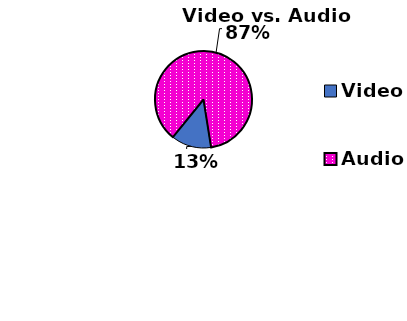
| Category | Series 0 |
|---|---|
| Video | 127 |
| Audio | 825 |